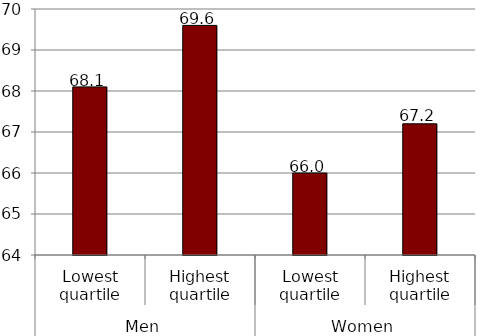
| Category | Series 0 |
|---|---|
| 0 | 68.1 |
| 1 | 69.6 |
| 2 | 66 |
| 3 | 67.2 |